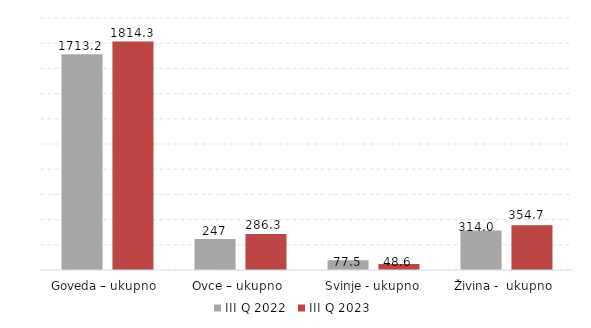
| Category | III Q 2022 | III Q 2023 |
|---|---|---|
| Goveda – ukupno  | 1713.2 | 1814.253 |
| Ovce – ukupno  | 247 | 286.3 |
| Svinje - ukupno | 77.5 | 48.6 |
| Živina -  ukupno  | 314 | 354.7 |